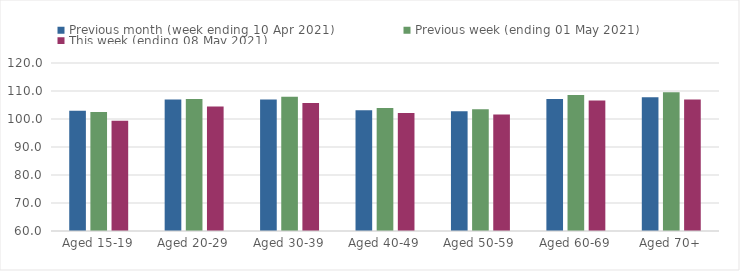
| Category | Previous month (week ending 10 Apr 2021) | Previous week (ending 01 May 2021) | This week (ending 08 May 2021) |
|---|---|---|---|
| Aged 15-19 | 102.99 | 102.52 | 99.35 |
| Aged 20-29 | 106.98 | 107.13 | 104.47 |
| Aged 30-39 | 106.96 | 107.92 | 105.72 |
| Aged 40-49 | 103.09 | 103.96 | 102.14 |
| Aged 50-59 | 102.81 | 103.46 | 101.6 |
| Aged 60-69 | 107.13 | 108.6 | 106.61 |
| Aged 70+ | 107.8 | 109.52 | 106.98 |